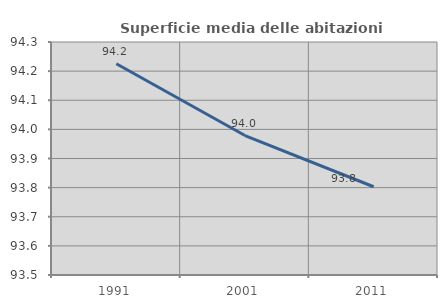
| Category | Superficie media delle abitazioni occupate |
|---|---|
| 1991.0 | 94.225 |
| 2001.0 | 93.979 |
| 2011.0 | 93.803 |